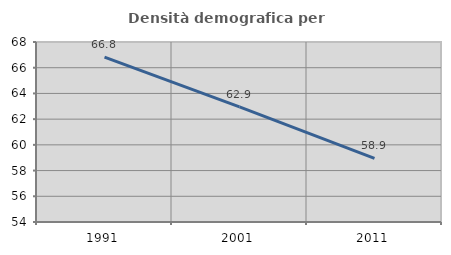
| Category | Densità demografica |
|---|---|
| 1991.0 | 66.818 |
| 2001.0 | 62.949 |
| 2011.0 | 58.944 |